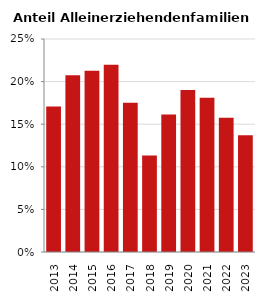
| Category | Anteil Alleinerziehende an Familien |
|---|---|
| 2013.0 | 0.171 |
| 2014.0 | 0.207 |
| 2015.0 | 0.213 |
| 2016.0 | 0.22 |
| 2017.0 | 0.175 |
| 2018.0 | 0.113 |
| 2019.0 | 0.161 |
| 2020.0 | 0.19 |
| 2021.0 | 0.181 |
| 2022.0 | 0.157 |
| 2023.0 | 0.137 |